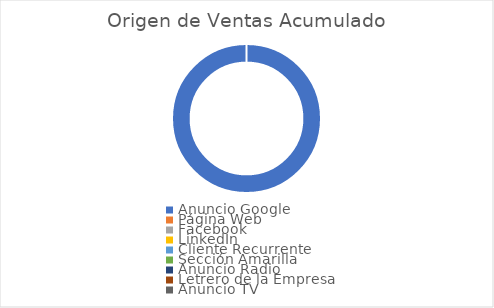
| Category | Series 0 |
|---|---|
| Anuncio Google | 1 |
| Página Web | 0 |
| Facebook | 0 |
| LinkedIn | 0 |
| Cliente Recurrente | 0 |
| Sección Amarilla | 0 |
| Anuncio Radio | 0 |
| Letrero de la Empresa | 0 |
| Anuncio TV | 0 |